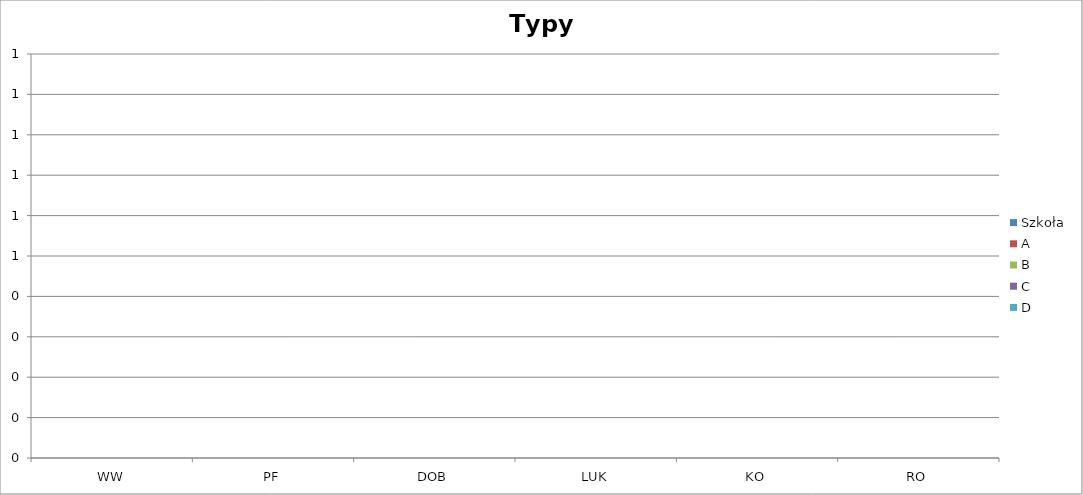
| Category | Szkoła | A | B | C | D |
|---|---|---|---|---|---|
| WW | 0 | 0 | 0 | 0 | 0 |
| PF | 0 | 0 | 0 | 0 | 0 |
| DOB | 0 | 0 | 0 | 0 | 0 |
| LUK | 0 | 0 | 0 | 0 | 0 |
| KO | 0 | 0 | 0 | 0 | 0 |
| RO | 0 | 0 | 0 | 0 | 0 |